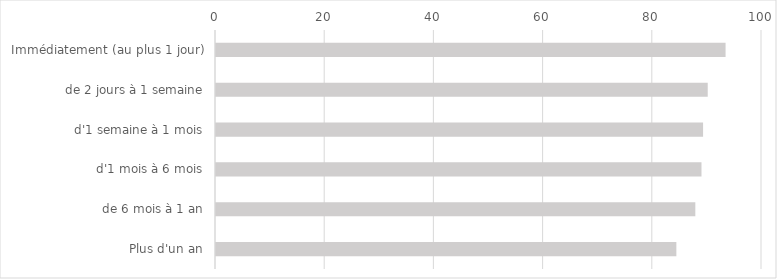
| Category | 2019 |
|---|---|
| Immédiatement (au plus 1 jour) | 93.328 |
| de 2 jours à 1 semaine | 90.059 |
| d'1 semaine à 1 mois | 89.208 |
| d'1 mois à 6 mois | 88.915 |
| de 6 mois à 1 an | 87.789 |
| Plus d'un an | 84.314 |